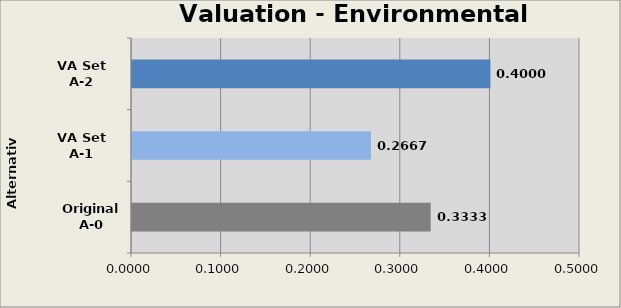
| Category | Environmental Impacts |
|---|---|
| Original A-0 | 0.333 |
| VA Set A-1 | 0.267 |
| VA Set A-2 | 0.4 |